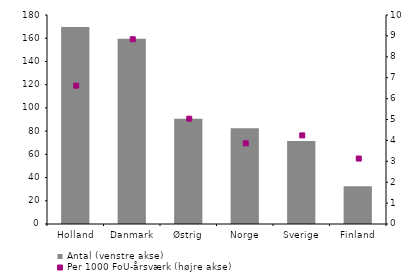
| Category | Antal (venstre akse) |
|---|---|
| Holland | 169.75 |
| Danmark | 159.5 |
| Østrig | 90.75 |
| Norge | 82.5 |
| Sverige | 71.5 |
| Finland | 32.5 |